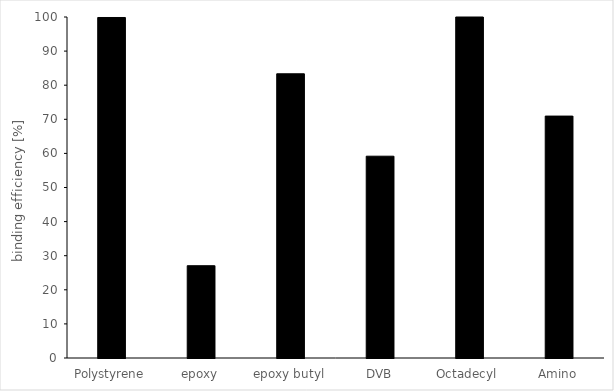
| Category | Series 0 |
|---|---|
| Polystyrene | 99.857 |
| epoxy | 27.066 |
| epoxy butyl | 83.347 |
| DVB | 59.182 |
| Octadecyl  | 100 |
| Amino | 70.943 |